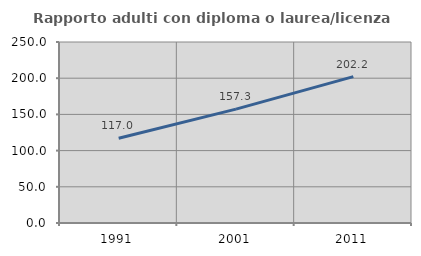
| Category | Rapporto adulti con diploma o laurea/licenza media  |
|---|---|
| 1991.0 | 117 |
| 2001.0 | 157.324 |
| 2011.0 | 202.227 |